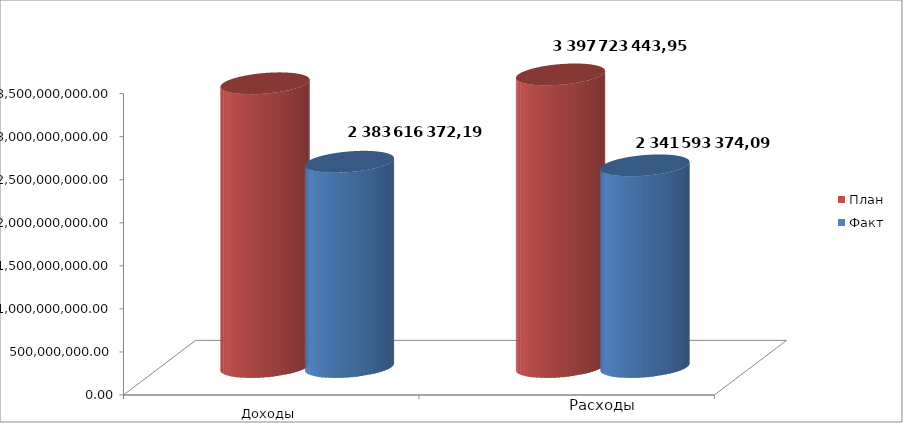
| Category | План | Факт |
|---|---|---|
| 0 | 3294790425.07 | 2383616372.19 |
| 1 | 3397723443.95 | 2341593374.09 |